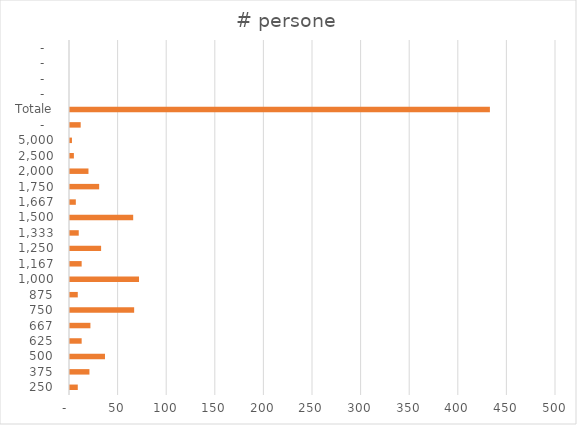
| Category | # persone |
|---|---|
|  250  | 8 |
|  375  | 20 |
|  500  | 36 |
|  625  | 12 |
|  667  | 21 |
|  750  | 66 |
|  875  | 8 |
|  1.000  | 71 |
|  1.167  | 12 |
|  1.250  | 32 |
|  1.333  | 9 |
|  1.500  | 65 |
|  1.667  | 6 |
|  1.750  | 30 |
|  2.000  | 19 |
|  2.500  | 4 |
|  5.000  | 2 |
|  -    | 11 |
|  Totale  | 432 |
|  -    | 0 |
|  -    | 0 |
|  -    | 0 |
|  -    | 0 |